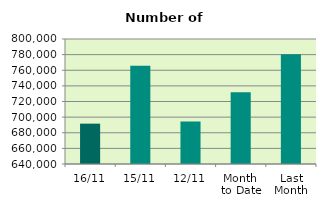
| Category | Series 0 |
|---|---|
| 16/11 | 691646 |
| 15/11 | 765616 |
| 12/11 | 694386 |
| Month 
to Date | 731765.833 |
| Last
Month | 780428.952 |